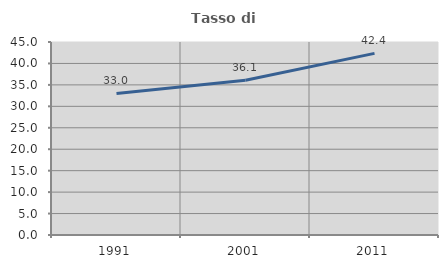
| Category | Tasso di occupazione   |
|---|---|
| 1991.0 | 32.994 |
| 2001.0 | 36.095 |
| 2011.0 | 42.35 |